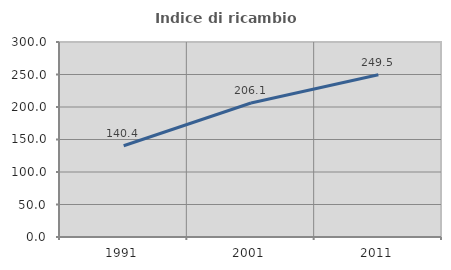
| Category | Indice di ricambio occupazionale  |
|---|---|
| 1991.0 | 140.404 |
| 2001.0 | 206.122 |
| 2011.0 | 249.524 |